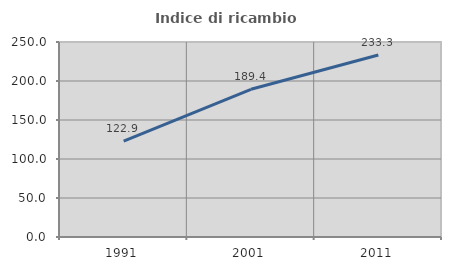
| Category | Indice di ricambio occupazionale  |
|---|---|
| 1991.0 | 122.901 |
| 2001.0 | 189.381 |
| 2011.0 | 233.333 |